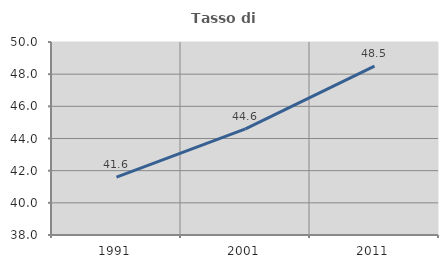
| Category | Tasso di occupazione   |
|---|---|
| 1991.0 | 41.602 |
| 2001.0 | 44.598 |
| 2011.0 | 48.498 |